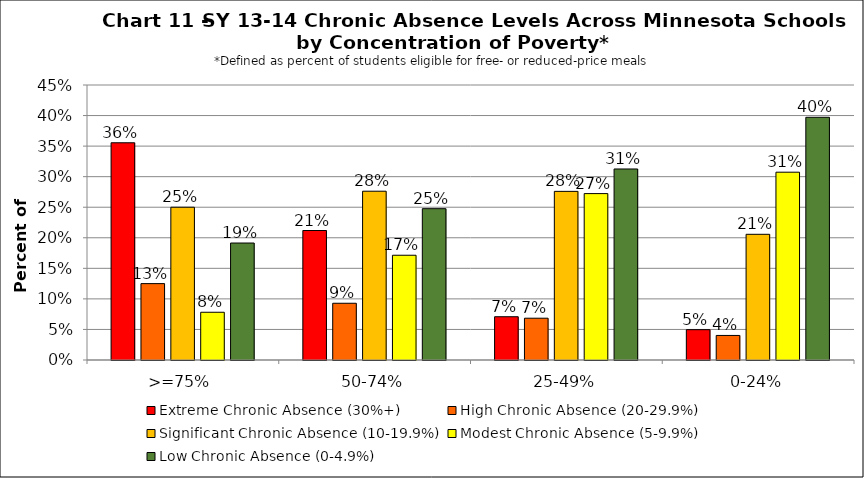
| Category | Extreme Chronic Absence (30%+) | High Chronic Absence (20-29.9%) | Significant Chronic Absence (10-19.9%) | Modest Chronic Absence (5-9.9%) | Low Chronic Absence (0-4.9%) |
|---|---|---|---|---|---|
| 0 | 0.355 | 0.125 | 0.25 | 0.078 | 0.191 |
| 1 | 0.212 | 0.093 | 0.276 | 0.171 | 0.248 |
| 2 | 0.071 | 0.068 | 0.276 | 0.272 | 0.313 |
| 3 | 0.05 | 0.04 | 0.206 | 0.307 | 0.397 |